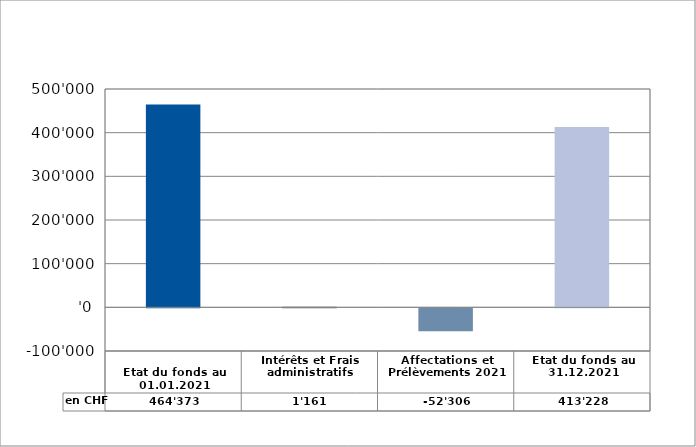
| Category | en CHF |
|---|---|
| 
Etat du fonds au 01.01.2021

 | 464373.25 |
| Intérêts et Frais administratifs | 1160.95 |
| Affectations et Prélèvements 2021 | -52306.25 |
| Etat du fonds au 31.12.2021 | 413227.95 |